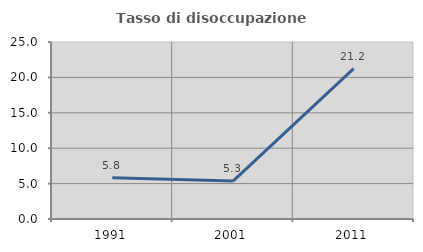
| Category | Tasso di disoccupazione giovanile  |
|---|---|
| 1991.0 | 5.828 |
| 2001.0 | 5.35 |
| 2011.0 | 21.226 |